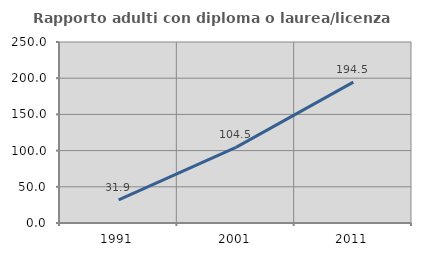
| Category | Rapporto adulti con diploma o laurea/licenza media  |
|---|---|
| 1991.0 | 31.92 |
| 2001.0 | 104.527 |
| 2011.0 | 194.515 |